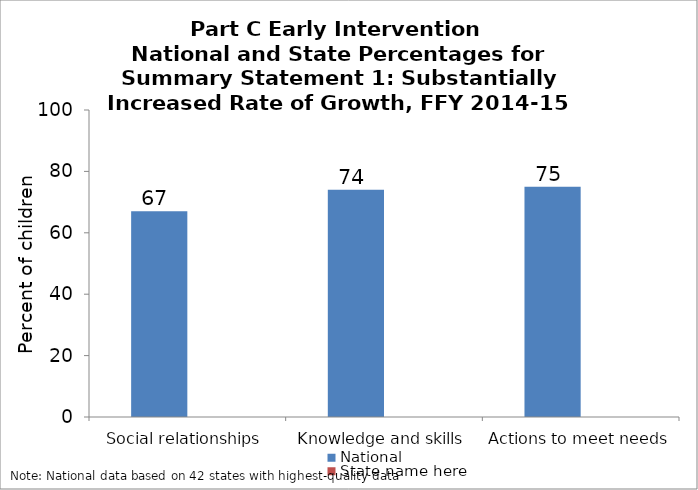
| Category | National | State name here |
|---|---|---|
| Social relationships | 67 |  |
| Knowledge and skills | 74 |  |
| Actions to meet needs | 75 |  |